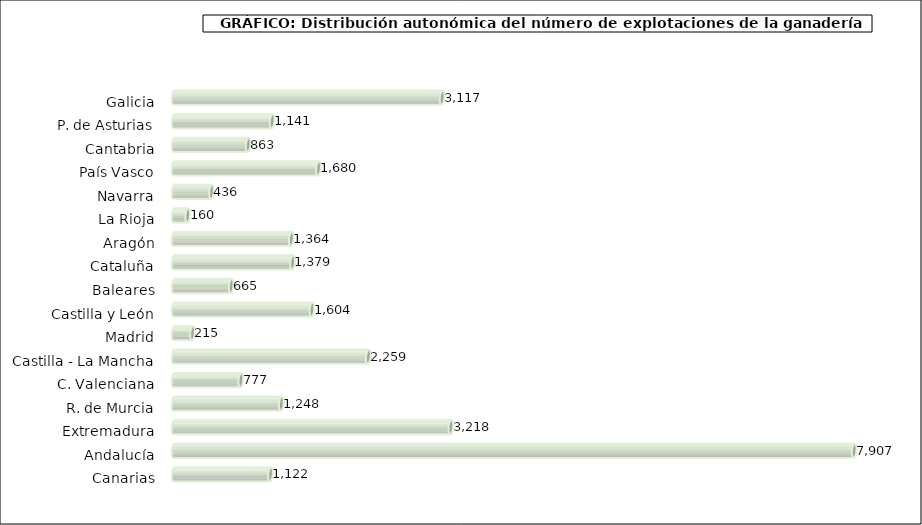
| Category | num. Explotaciones |
|---|---|
|   Galicia | 3117 |
|   P. de Asturias | 1141 |
|   Cantabria | 863 |
|   País Vasco | 1680 |
|   Navarra | 436 |
|   La Rioja | 160 |
|   Aragón | 1364 |
|   Cataluña | 1379 |
|   Baleares | 665 |
|   Castilla y León | 1604 |
|   Madrid | 215 |
|   Castilla - La Mancha | 2259 |
|   C. Valenciana | 777 |
|   R. de Murcia | 1248 |
|   Extremadura | 3218 |
|   Andalucía | 7907 |
|   Canarias | 1122 |